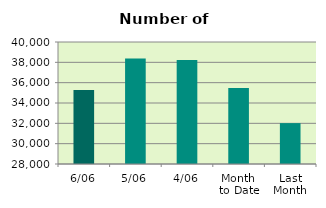
| Category | Series 0 |
|---|---|
| 6/06 | 35272 |
| 5/06 | 38382 |
| 4/06 | 38230 |
| Month 
to Date | 35470 |
| Last
Month | 32020.364 |